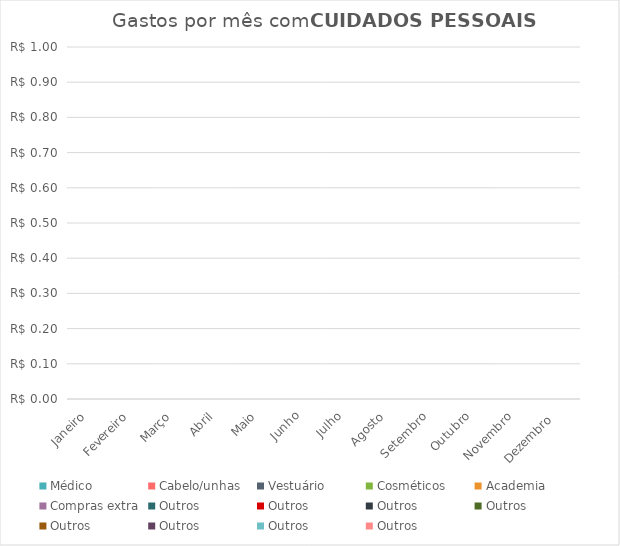
| Category | Médico | Cabelo/unhas | Vestuário | Cosméticos | Academia | Compras extra | Outros |
|---|---|---|---|---|---|---|---|
| Janeiro | 0 | 0 | 0 | 0 | 0 | 0 | 0 |
| Fevereiro | 0 | 0 | 0 | 0 | 0 | 0 | 0 |
| Março | 0 | 0 | 0 | 0 | 0 | 0 | 0 |
| Abril | 0 | 0 | 0 | 0 | 0 | 0 | 0 |
| Maio | 0 | 0 | 0 | 0 | 0 | 0 | 0 |
| Junho | 0 | 0 | 0 | 0 | 0 | 0 | 0 |
| Julho | 0 | 0 | 0 | 0 | 0 | 0 | 0 |
| Agosto | 0 | 0 | 0 | 0 | 0 | 0 | 0 |
| Setembro | 0 | 0 | 0 | 0 | 0 | 0 | 0 |
| Outubro | 0 | 0 | 0 | 0 | 0 | 0 | 0 |
| Novembro | 0 | 0 | 0 | 0 | 0 | 0 | 0 |
| Dezembro  | 0 | 0 | 0 | 0 | 0 | 0 | 0 |